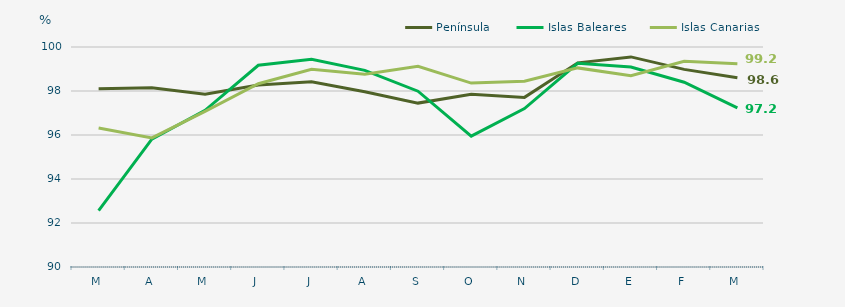
| Category | Península | Islas Baleares | Islas Canarias |
|---|---|---|---|
| M | 98.1 | 92.56 | 96.32 |
| A | 98.15 | 95.81 | 95.87 |
| M | 97.85 | 97.12 | 97.07 |
| J | 98.27 | 99.17 | 98.33 |
| J | 98.42 | 99.44 | 98.99 |
| A | 97.97 | 98.94 | 98.76 |
| S | 97.45 | 97.99 | 99.12 |
| O | 97.85 | 95.95 | 98.36 |
| N | 97.71 | 97.2 | 98.44 |
| D | 99.28 | 99.26 | 99.05 |
| E | 99.55 | 99.09 | 98.69 |
| F | 98.984 | 98.4 | 99.35 |
| M | 98.6 | 97.23 | 99.24 |